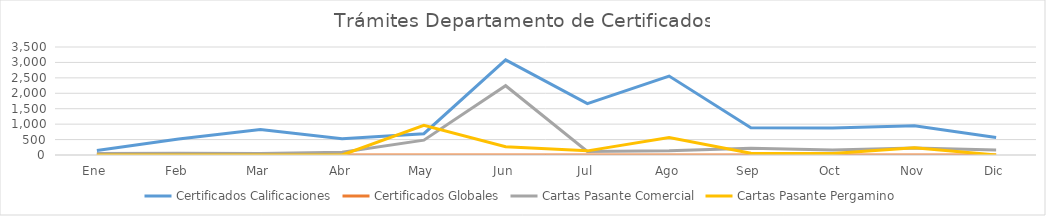
| Category | Certificados Calificaciones | Certificados Globales | Cartas Pasante Comercial | Cartas Pasante Pergamino |
|---|---|---|---|---|
| Ene | 146 | 1 | 51 | 0 |
| Feb | 520 | 0 | 59 | 0 |
| Mar | 824 | 0 | 52 | 0 |
| Abr | 527 | 0 | 93 | 0 |
| May | 691 | 0 | 480 | 962 |
| Jun | 3085 | 0 | 2245 | 265 |
| Jul | 1665 | 0 | 114 | 134 |
| Ago | 2558 | 0 | 137 | 569 |
| Sep | 883 | 3 | 219 | 59 |
| Oct | 877 | 1 | 164 | 49 |
| Nov | 951 | 1 | 227 | 236 |
| Dic | 568 | 0 | 164 | 0 |